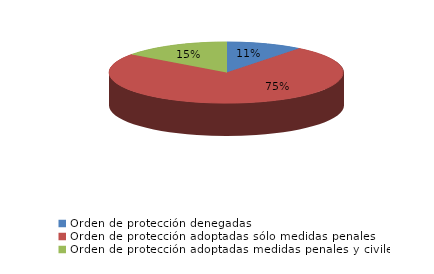
| Category | Series 0 |
|---|---|
| Orden de protección denegadas | 12 |
| Orden de protección adoptadas sólo medidas penales | 85 |
| Orden de protección adoptadas medidas penales y civiles | 17 |